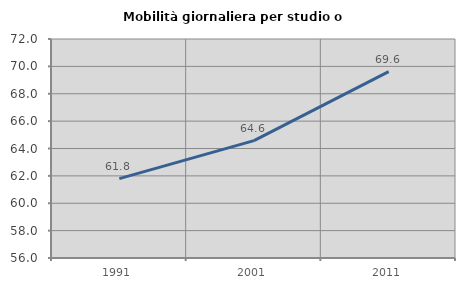
| Category | Mobilità giornaliera per studio o lavoro |
|---|---|
| 1991.0 | 61.802 |
| 2001.0 | 64.577 |
| 2011.0 | 69.613 |